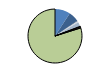
| Category | Series 0 |
|---|---|
| ARRASTRE | 79 |
| CERCO | 53 |
| ATUNEROS CAÑEROS | 3 |
| PALANGRE DE FONDO | 7 |
| PALANGRE DE SUPERFICIE | 22 |
| RASCO | 0 |
| VOLANTA | 3 |
| ARTES FIJAS | 6 |
| ARTES MENORES | 685 |